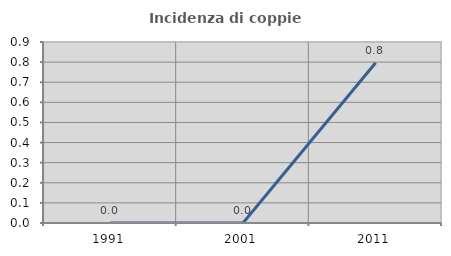
| Category | Incidenza di coppie miste |
|---|---|
| 1991.0 | 0 |
| 2001.0 | 0 |
| 2011.0 | 0.797 |